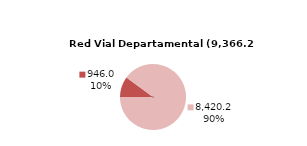
| Category | RV Departamental |
|---|---|
| Pavimentada | 945.984 |
| No Pavimentada | 8420.234 |